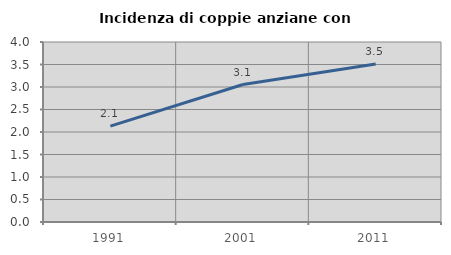
| Category | Incidenza di coppie anziane con figli |
|---|---|
| 1991.0 | 2.13 |
| 2001.0 | 3.055 |
| 2011.0 | 3.513 |